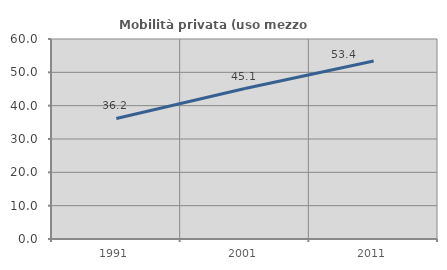
| Category | Mobilità privata (uso mezzo privato) |
|---|---|
| 1991.0 | 36.156 |
| 2001.0 | 45.14 |
| 2011.0 | 53.382 |